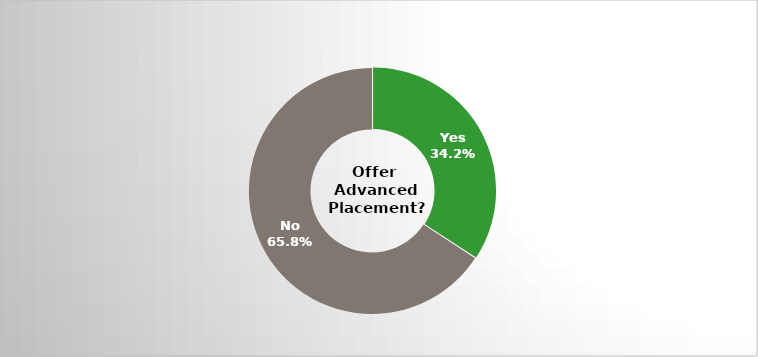
| Category | Series 0 |
|---|---|
| Yes | 0.342 |
| No | 0.658 |